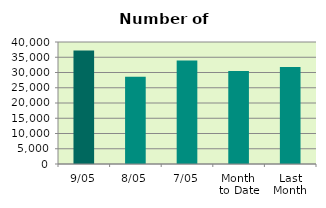
| Category | Series 0 |
|---|---|
| 9/05 | 37228 |
| 8/05 | 28582 |
| 7/05 | 33898 |
| Month 
to Date | 30479.333 |
| Last
Month | 31788.9 |